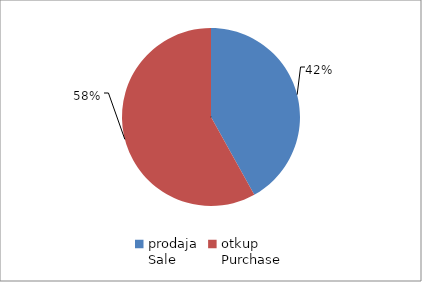
| Category | Series 0 |
|---|---|
| prodaja
Sale | 15823195 |
| otkup
Purchase | 21925500 |